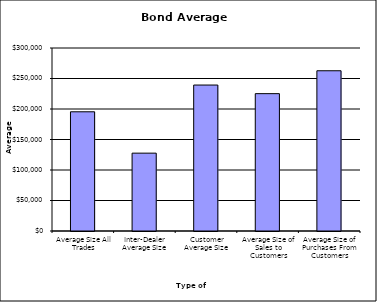
| Category | Security Type |
|---|---|
| Average Size All Trades | 195437.453 |
| Inter-Dealer Average Size | 127618.584 |
| Customer Average Size | 239287.392 |
| Average Size of Sales to Customers | 225161.953 |
| Average Size of Purchases From Customers | 262684.708 |